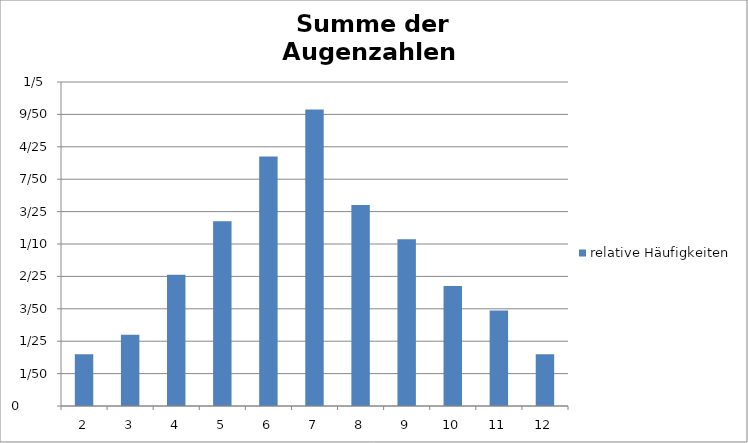
| Category | relative Häufigkeiten |
|---|---|
| 2.0 | 0.032 |
| 3.0 | 0.044 |
| 4.0 | 0.081 |
| 5.0 | 0.114 |
| 6.0 | 0.154 |
| 7.0 | 0.183 |
| 8.0 | 0.124 |
| 9.0 | 0.103 |
| 10.0 | 0.074 |
| 11.0 | 0.059 |
| 12.0 | 0.032 |